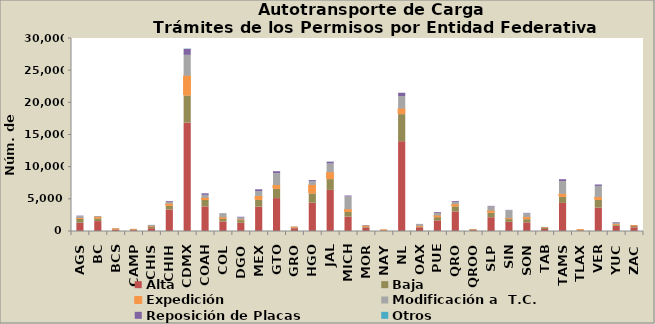
| Category | Alta                                         | Baja | Expedición | Modificación a  T.C. | Reposición de Placas | Otros |
|---|---|---|---|---|---|---|
| AGS | 1284 | 602 | 135 | 265 | 101 | 1 |
| BC | 1539 | 436 | 213 | 126 | 12 | 0 |
| BCS | 237 | 36 | 14 | 77 | 4 | 1 |
| CAMP | 137 | 46 | 19 | 47 | 6 | 0 |
| CHIS | 433 | 231 | 47 | 223 | 17 | 1 |
| CHIH | 3350 | 563 | 335 | 290 | 125 | 1 |
| CDMX | 16857 | 4220 | 3061 | 3238 | 941 | 35 |
| COAH | 3828 | 994 | 334 | 459 | 245 | 3 |
| COL | 1490 | 374 | 250 | 612 | 47 | 1 |
| DGO | 1279 | 418 | 98 | 293 | 126 | 1 |
| MEX | 3787 | 1058 | 607 | 758 | 273 | 4 |
| GTO | 5114 | 1461 | 568 | 1846 | 304 | 2 |
| GRO | 431 | 71 | 86 | 51 | 14 | 5 |
| HGO | 4392 | 1463 | 1312 | 555 | 198 | 9 |
| JAL | 6389 | 1681 | 1073 | 1349 | 276 | 28 |
| MICH | 2246 | 713 | 422 | 1985 | 144 | 6 |
| MOR | 558 | 152 | 62 | 83 | 37 | 1 |
| NAY | 68 | 23 | 20 | 48 | 13 | 0 |
| NL | 13958 | 4212 | 856 | 1960 | 502 | 5 |
| OAX | 574 | 137 | 75 | 292 | 24 | 1 |
| PUE | 1651 | 502 | 263 | 393 | 128 | 2 |
| QRO | 3043 | 801 | 321 | 334 | 144 | 0 |
| QROO | 133 | 24 | 65 | 61 | 3 | 0 |
| SLP | 2137 | 721 | 307 | 641 | 101 | 1 |
| SIN | 1426 | 429 | 142 | 1228 | 58 | 1 |
| SON | 1346 | 499 | 321 | 564 | 88 | 7 |
| TAB | 308 | 157 | 81 | 64 | 14 | 10 |
| TAMS | 4366 | 967 | 445 | 1984 | 289 | 1 |
| TLAX | 100 | 37 | 16 | 20 | 3 | 1 |
| VER | 3645 | 1208 | 415 | 1741 | 220 | 6 |
| YUC | 821 | 198 | 74 | 205 | 92 | 0 |
| ZAC | 579 | 196 | 33 | 24 | 17 | 0 |